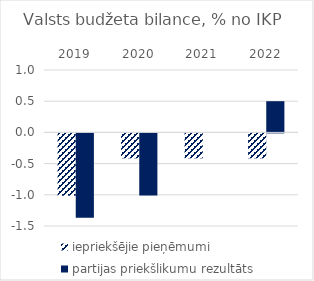
| Category | iepriekšējie pieņēmumi | partijas priekšlikumu rezultāts |
|---|---|---|
| 2019.0 | -1 | -1.352 |
| 2020.0 | -0.4 | -0.994 |
| 2021.0 | -0.4 | 0 |
| 2022.0 | -0.4 | 0.5 |